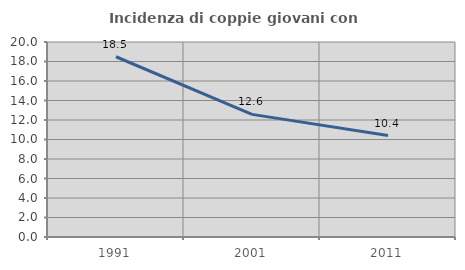
| Category | Incidenza di coppie giovani con figli |
|---|---|
| 1991.0 | 18.487 |
| 2001.0 | 12.578 |
| 2011.0 | 10.401 |